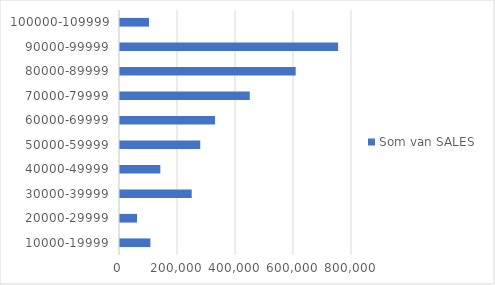
| Category | Totaal |
|---|---|
| 10000-19999 | 104839 |
| 20000-29999 | 58557 |
| 30000-39999 | 247278 |
| 40000-49999 | 139092 |
| 50000-59999 | 276745 |
| 60000-69999 | 327780 |
| 70000-79999 | 447450 |
| 80000-89999 | 605809 |
| 90000-99999 | 752095 |
| 100000-109999 | 100000 |